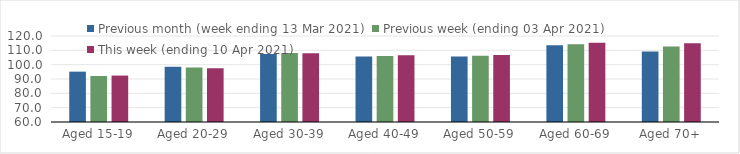
| Category | Previous month (week ending 13 Mar 2021) | Previous week (ending 03 Apr 2021) | This week (ending 10 Apr 2021) |
|---|---|---|---|
| Aged 15-19 | 95.13 | 92.11 | 92.39 |
| Aged 20-29 | 98.6 | 97.95 | 97.51 |
| Aged 30-39 | 107.45 | 108.13 | 108.02 |
| Aged 40-49 | 105.67 | 106.08 | 106.6 |
| Aged 50-59 | 105.67 | 106.16 | 106.78 |
| Aged 60-69 | 113.63 | 114.25 | 115.34 |
| Aged 70+ | 109.19 | 112.7 | 114.98 |